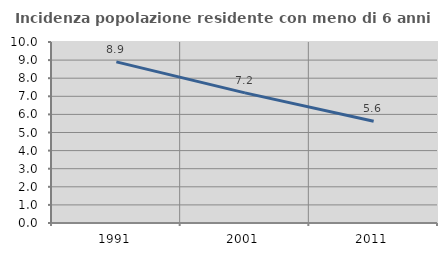
| Category | Incidenza popolazione residente con meno di 6 anni |
|---|---|
| 1991.0 | 8.904 |
| 2001.0 | 7.191 |
| 2011.0 | 5.622 |